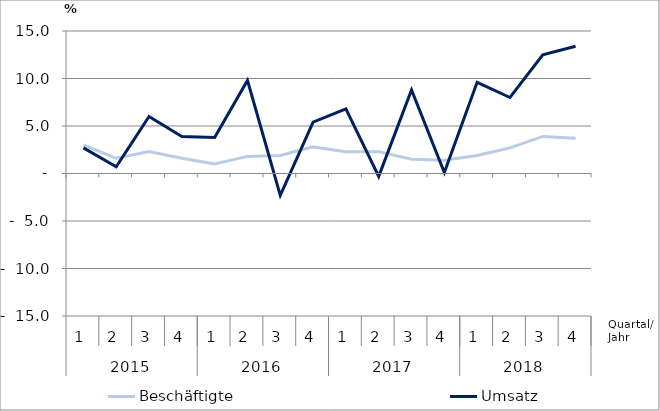
| Category | Beschäftigte | Umsatz |
|---|---|---|
| 0 | 3 | 2.7 |
| 1 | 1.6 | 0.7 |
| 2 | 2.3 | 6 |
| 3 | 1.6 | 3.9 |
| 4 | 1 | 3.8 |
| 5 | 1.8 | 9.8 |
| 6 | 1.9 | -2.3 |
| 7 | 2.8 | 5.4 |
| 8 | 2.3 | 6.8 |
| 9 | 2.3 | -0.3 |
| 10 | 1.5 | 8.8 |
| 11 | 1.4 | 0.1 |
| 12 | 1.9 | 9.6 |
| 13 | 2.7 | 8 |
| 14 | 3.9 | 12.5 |
| 15 | 3.7 | 13.4 |